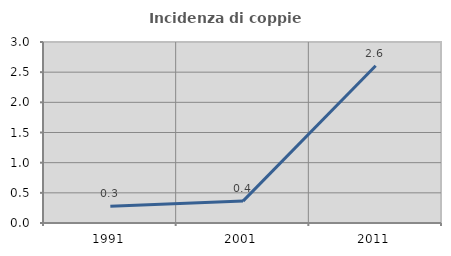
| Category | Incidenza di coppie miste |
|---|---|
| 1991.0 | 0.276 |
| 2001.0 | 0.363 |
| 2011.0 | 2.607 |